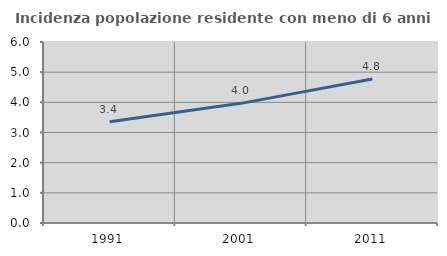
| Category | Incidenza popolazione residente con meno di 6 anni |
|---|---|
| 1991.0 | 3.353 |
| 2001.0 | 3.966 |
| 2011.0 | 4.771 |